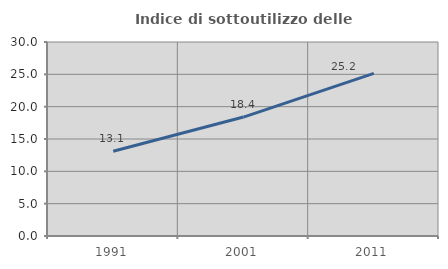
| Category | Indice di sottoutilizzo delle abitazioni  |
|---|---|
| 1991.0 | 13.116 |
| 2001.0 | 18.393 |
| 2011.0 | 25.156 |